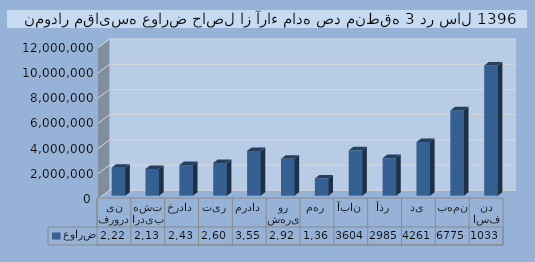
| Category | عوارض |
|---|---|
| فروردین | 2227670 |
| اردیبهشت | 2130622 |
| خرداد | 2435190 |
| تیر | 2605210 |
| مرداد | 3559433 |
| شهریور | 2926924 |
| مهر | 1369283 |
| آبان | 3604526 |
| آذر | 2985813 |
| دی | 4261489 |
| بهمن | 6775231 |
| اسفند | 10339961 |